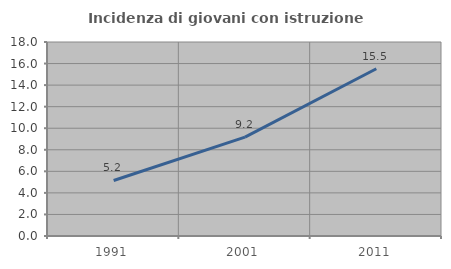
| Category | Incidenza di giovani con istruzione universitaria |
|---|---|
| 1991.0 | 5.152 |
| 2001.0 | 9.177 |
| 2011.0 | 15.522 |